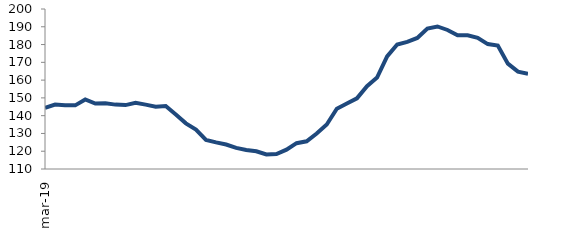
| Category | Series 1 |
|---|---|
| 2019-03-01 | 144.401 |
| 2019-04-01 | 146.271 |
| 2019-05-01 | 145.826 |
| 2019-06-01 | 145.804 |
| 2019-07-01 | 149.147 |
| 2019-08-01 | 146.814 |
| 2019-09-01 | 146.921 |
| 2019-10-01 | 146.216 |
| 2019-11-01 | 145.952 |
| 2019-12-01 | 147.284 |
| 2020-01-01 | 146.194 |
| 2020-02-01 | 144.98 |
| 2020-03-01 | 145.471 |
| 2020-04-01 | 140.66 |
| 2020-05-01 | 135.678 |
| 2020-06-01 | 132.14 |
| 2020-07-01 | 126.404 |
| 2020-08-01 | 124.978 |
| 2020-09-01 | 123.76 |
| 2020-10-01 | 121.904 |
| 2020-11-01 | 120.729 |
| 2020-12-01 | 119.982 |
| 2021-01-01 | 118.16 |
| 2021-02-01 | 118.385 |
| 2021-03-01 | 120.897 |
| 2021-04-01 | 124.521 |
| 2021-05-01 | 125.561 |
| 2021-06-01 | 129.991 |
| 2021-07-01 | 135.036 |
| 2021-08-01 | 143.93 |
| 2021-09-01 | 146.816 |
| 2021-10-01 | 149.733 |
| 2021-11-01 | 156.598 |
| 2021-12-01 | 161.424 |
| 2022-01-01 | 173.373 |
| 2022-02-01 | 180.016 |
| 2022-03-01 | 181.525 |
| 2022-04-01 | 183.732 |
| 2022-05-01 | 189.013 |
| 2022-06-01 | 190.184 |
| 2022-07-01 | 188.199 |
| 2022-08-01 | 185.247 |
| 2022-09-01 | 185.209 |
| 2022-10-01 | 183.82 |
| 2022-11-01 | 180.268 |
| 2022-12-01 | 179.472 |
| 2023-01-01 | 169.264 |
| 2023-02-01 | 164.751 |
| 2023-03-01 | 163.49 |